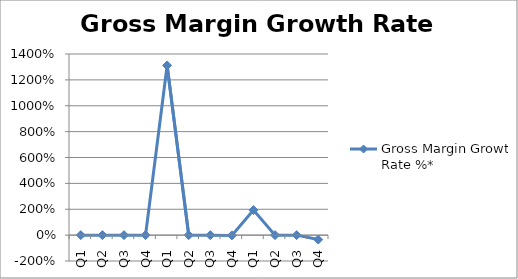
| Category | Gross Margin Growth Rate %* |
|---|---|
| Q1 | 0 |
| Q2 | 0 |
| Q3 | 0 |
| Q4 | 0 |
| Q1 | 13.115 |
| Q2 | 0 |
| Q3 | 0 |
| Q4 | -0.021 |
| Q1 | 1.936 |
| Q2 | 0 |
| Q3 | 0 |
| Q4 | -0.342 |